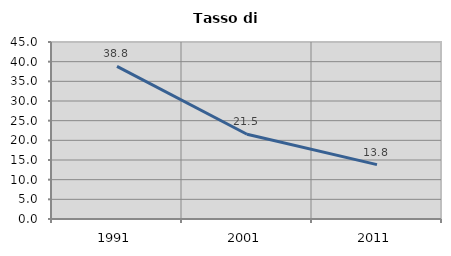
| Category | Tasso di disoccupazione   |
|---|---|
| 1991.0 | 38.806 |
| 2001.0 | 21.538 |
| 2011.0 | 13.834 |